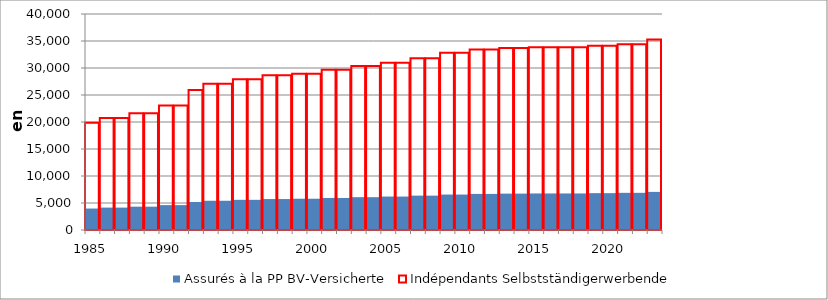
| Category | Assurés à la PP | Indépendants |
|---|---|---|
| 1985 | 3974 | 19872 |
| 1986 | 4147 | 20736 |
| 1987 | 4147 | 20736 |
| 1988 | 4320 | 21600 |
| 1989 | 4320 | 21600 |
| 1990 | 4608 | 23040 |
| 1991 | 4608 | 23040 |
| 1992 | 5184 | 25920 |
| 1993 | 5414 | 27072 |
| 1994 | 5414 | 27072 |
| 1995 | 5587 | 27936 |
| 1996 | 5587 | 27936 |
| 1997 | 5731 | 28656 |
| 1998 | 5731 | 28656 |
| 1999 | 5789 | 28944 |
| 2000 | 5789 | 28944 |
| 2001 | 5933 | 29664 |
| 2002 | 5933 | 29664 |
| 2003 | 6077 | 30384 |
| 2004 | 6077 | 30384 |
| 2005 | 6192 | 30960 |
| 2006 | 6192 | 30960 |
| 2007 | 6365 | 31824 |
| 2008 | 6365 | 31824 |
| 2009 | 6566 | 32832 |
| 2010 | 6566 | 32832 |
| 2011 | 6682 | 33408 |
| 2012 | 6682 | 33408 |
| 2013 | 6739 | 33696 |
| 2014 | 6739 | 33696 |
| 2015 | 6768 | 33840 |
| 2016 | 6768 | 33840 |
| 2017 | 6768 | 33840 |
| 2018 | 6768 | 33840 |
| 2019 | 6826 | 34128 |
| 2020 | 6826 | 34128 |
| 2021 | 6883 | 34416 |
| 2022 | 6883 | 34416 |
| 2023 | 7056 | 35280 |